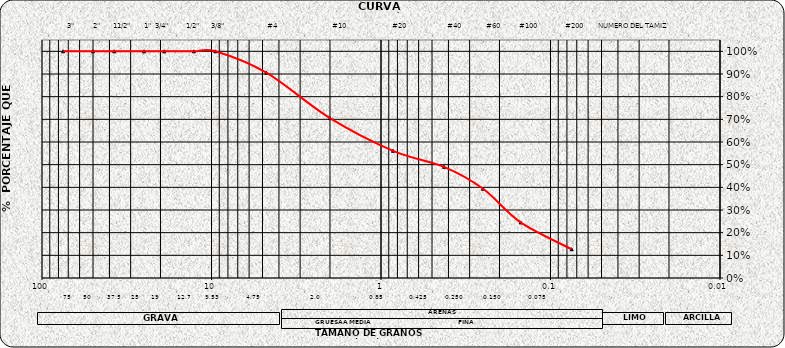
| Category | Series 0 |
|---|---|
| 75.0 | 1 |
| 50.0 | 1 |
| 37.5 | 1 |
| 25.0 | 1 |
| 19.0 | 1 |
| 12.7 | 1 |
| 9.5 | 1 |
| 4.75 | 0.906 |
| 2.0 | 0.705 |
| 0.85 | 0.561 |
| 0.425 | 0.49 |
| 0.25 | 0.394 |
| 0.15 | 0.245 |
| 0.075 | 0.127 |
| nan | 0 |